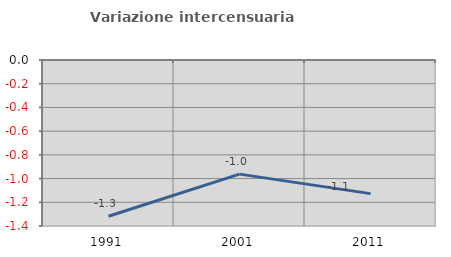
| Category | Variazione intercensuaria annua |
|---|---|
| 1991.0 | -1.318 |
| 2001.0 | -0.963 |
| 2011.0 | -1.127 |